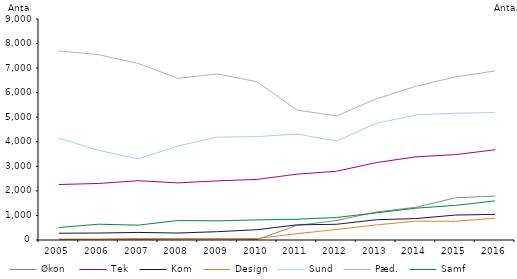
| Category | Økon  | Tek | Kom | Design | Sund | Pæd. | Samf |
|---|---|---|---|---|---|---|---|
| 2005.0 | 26 | 2260 | 275 | 38 | 4146 | 7699 | 509 |
| 2006.0 | 8 | 2302 | 284 | 37 | 3652 | 7548 | 643 |
| 2007.0 | 16 | 2414 | 308 | 64 | 3302 | 7191 | 605 |
| 2008.0 | 40 | 2326 | 284 | 60 | 3827 | 6584 | 793 |
| 2009.0 | 40 | 2409 | 339 | 56 | 4192 | 6764 | 779 |
| 2010.0 | 19 | 2468 | 419 | 60 | 4209 | 6443 | 820 |
| 2011.0 | 594 | 2681 | 617 | 256 | 4315 | 5293 | 846 |
| 2012.0 | 792 | 2800 | 640 | 428 | 4031 | 5051 | 918 |
| 2013.0 | 1142 | 3151 | 825 | 613 | 4749 | 5744 | 1103 |
| 2014.0 | 1333 | 3387 | 872 | 767 | 5094 | 6261 | 1296 |
| 2015.0 | 1719 | 3477 | 1016 | 763 | 5163 | 6643 | 1410 |
| 2016.0 | 1791 | 3675 | 1043 | 888 | 5193 | 6887 | 1593 |